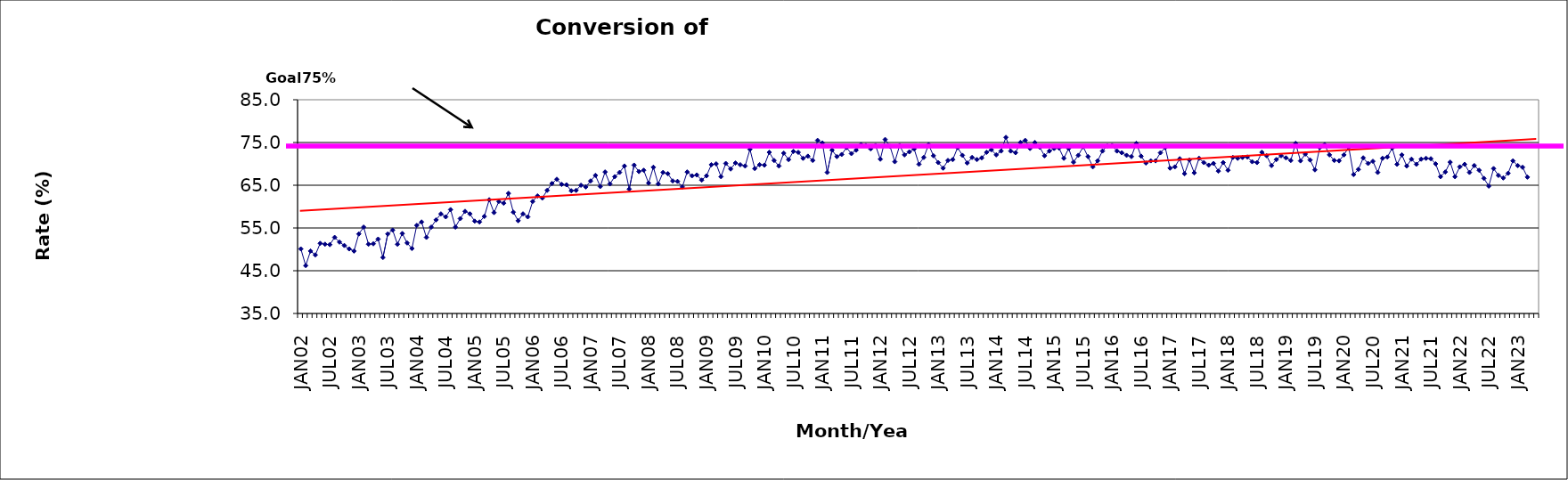
| Category | Series 0 |
|---|---|
| JAN02 | 50.1 |
| FEB02 | 46.2 |
| MAR02 | 49.6 |
| APR02 | 48.7 |
| MAY02 | 51.4 |
| JUN02 | 51.2 |
| JUL02 | 51.1 |
| AUG02 | 52.8 |
| SEP02 | 51.7 |
| OCT02 | 50.9 |
| NOV02 | 50.1 |
| DEC02 | 49.6 |
| JAN03 | 53.6 |
| FEB03 | 55.2 |
| MAR03 | 51.2 |
| APR03 | 51.3 |
| MAY03 | 52.4 |
| JUN03 | 48.1 |
| JUL03 | 53.6 |
| AUG03 | 54.5 |
| SEP03 | 51.2 |
| OCT03 | 53.7 |
| NOV03 | 51.5 |
| DEC03 | 50.2 |
| JAN04 | 55.6 |
| FEB04 | 56.4 |
| MAR04 | 52.8 |
| APR04 | 55.2 |
| MAY04 | 56.9 |
| JUN04 | 58.3 |
| JUL04 | 57.6 |
| AUG04 | 59.3 |
| SEP04 | 55.2 |
| OCT04 | 57.2 |
| NOV04 | 58.9 |
| DEC04 | 58.3 |
| JAN05 | 56.6 |
| FEB05 | 56.4 |
| MAR05 | 57.7 |
| APR05 | 61.6 |
| MAY05 | 58.6 |
| JUN05 | 61.2 |
| JUL05 | 60.8 |
| AUG05 | 63.1 |
| SEP05 | 58.7 |
| OCT05 | 56.7 |
| NOV05 | 58.3 |
| DEC05 | 57.6 |
| JAN06 | 61.2 |
| FEB06 | 62.5 |
| MAR06 | 62 |
| APR06 | 63.8 |
| MAY06 | 65.4 |
| JUN06 | 66.4 |
| JUL06 | 65.2 |
| AUG06 | 65.1 |
| SEP06 | 63.7 |
| OCT06 | 63.8 |
| NOV06 | 65 |
| DEC06 | 64.6 |
| JAN07 | 66 |
| FEB07 | 67.3 |
| MAR07 | 64.7 |
| APR07 | 68.1 |
| MAY07 | 65.3 |
| JUN07 | 67 |
| JUL07 | 68 |
| AUG07 | 69.5 |
| SEP07 | 64.1 |
| OCT07 | 69.7 |
| NOV07 | 68.2 |
| DEC07 | 68.5 |
| JAN08 | 65.5 |
| FEB08 | 69.2 |
| MAR08 | 65.3 |
| APR08 | 68 |
| MAY08 | 67.7 |
| JUN08 | 66 |
| JUL08 | 65.9 |
| AUG08 | 64.6 |
| SEP08 | 68.1 |
| OCT08 | 67.2 |
| NOV08 | 67.4 |
| DEC08 | 66.2 |
| JAN09 | 67.2 |
| FEB09 | 69.8 |
| MAR09 | 70 |
| APR09 | 67 |
| MAY09 | 70.1 |
| JUN09 | 68.8 |
| JUL09 | 70.2 |
| AUG09 | 69.8 |
| SEP09 | 69.5 |
| OCT09 | 73.4 |
| NOV09 | 68.9 |
| DEC09 | 69.8 |
| JAN10 | 69.7 |
| FEB10 | 72.7 |
| MAR10 | 70.8 |
| APR10 | 69.5 |
| MAY10 | 72.5 |
| JUN10 | 71 |
| JUL10 | 72.9 |
| AUG10 | 72.7 |
| SEP10 | 71.3 |
| OCT10 | 71.8 |
| NOV10 | 70.8 |
| DEC10 | 75.5 |
| JAN11 | 74.9 |
| FEB11 | 68 |
| MAR11 | 73.2 |
| APR11 | 71.7 |
| MAY11 | 72.2 |
| JUN11 | 73.8 |
| JUL11 | 72.4 |
| AUG11 | 73.2 |
| SEP11 | 74.5 |
| OCT11 | 74.3 |
| NOV11 | 73.5 |
| DEC11 | 74.3 |
| JAN12 | 71.1 |
| FEB12 | 75.7 |
| MAR12 | 74.1 |
| APR12 | 70.5 |
| MAY12 | 74.3 |
| JUN12 | 72.1 |
| JUL12 | 72.8 |
| AUG12 | 73.5 |
| SEP12 | 69.9 |
| OCT12 | 71.5 |
| NOV12 | 74.5 |
| DEC12 | 71.9 |
| JAN13 | 70.3 |
| FEB13 | 69 |
| MAR13 | 70.8 |
| APR13 | 71 |
| MAY13 | 73.8 |
| JUN13 | 72 |
| JUL13 | 70.2 |
| AUG13 | 71.5 |
| SEP13 | 71 |
| OCT13 | 71.4 |
| NOV13 | 72.7 |
| DEC13 | 73.3 |
| JAN14 | 72.1 |
| FEB14 | 73 |
| MAR14 | 76.2 |
| APR14 | 73 |
| MAY14 | 72.6 |
| JUN14 | 75 |
| JUL14 | 75.5 |
| AUG14 | 73.6 |
| SEP14 | 75 |
| OCT14 | 73.9 |
| NOV14 | 71.9 |
| DEC14 | 73 |
| JAN15 | 73.6 |
| FEB15 | 73.7 |
| MAR15 | 71.3 |
| APR15 | 73.6 |
| MAY15 | 70.4 |
| JUN15 | 72 |
| JUL15 | 74 |
| AUG15 | 71.7 |
| SEP15 | 69.3 |
| OCT15 | 70.7 |
| NOV15 | 73 |
| DEC15 | 74.2 |
| JAN16 | 74.3 |
| FEB16 | 73 |
| MAR16 | 72.6 |
| APR16 | 72 |
| MAY16 | 71.7 |
| JUN16 | 74.8 |
| JUL16 | 71.8 |
| AUG16 | 70.2 |
| SEP16 | 70.7 |
| OCT16 | 70.7 |
| NOV16 | 72.6 |
| DEC16 | 73.8 |
| JAN17 | 69 |
| FEB17 | 69.3 |
| MAR17 | 71.2 |
| APR17 | 67.7 |
| MAY17 | 70.9 |
| JUN17 | 67.9 |
| JUL17 | 71.3 |
| AUG17 | 70.3 |
| SEP17 | 69.7 |
| OCT17 | 70.1 |
| NOV17 | 68.3 |
| DEC17 | 70.3 |
| JAN18 | 68.5 |
| FEB18 | 71.5 |
| MAR18 | 71.3 |
| APR18 | 71.5 |
| MAY18 | 71.6 |
| JUN18 | 70.5 |
| JUL18 | 70.3 |
| AUG18 | 72.7 |
| SEP18 | 71.9 |
| OCT18 | 69.6 |
| NOV18 | 71 |
| DEC18 | 71.9 |
| JAN19 | 71.4 |
| FEB19 | 70.8 |
| MAR19 | 74.8 |
| APR19 | 70.7 |
| MAY19 | 72.3 |
| JUN19 | 70.9 |
| JUL19 | 68.6 |
| AUG19 | 73.8 |
| SEP19 | 74.5 |
| OCT19 | 72.1 |
| NOV19 | 70.8 |
| DEC19 | 70.7 |
| JAN20 | 72.1 |
| FEB20 | 73.9 |
| MAR20 | 67.5 |
| APR20 | 68.7 |
| MAY20 | 71.4 |
| JUN20 | 70.1 |
| JUL20 | 70.6 |
| AUG20 | 68 |
| SEP20 | 71.3 |
| OCT20 | 71.6 |
| NOV20 | 73.7 |
| DEC20 | 69.9 |
| JAN21 | 72.1 |
| FEB21 | 69.5 |
| MAR21 | 71.1 |
| APR21 | 69.9 |
| MAY21 | 71.1 |
| JUN21 | 71.3 |
| JUL21 | 71.2 |
| AUG21 | 70 |
| SEP21 | 67 |
| OCT21 | 68.1 |
| NOV21 | 70.4 |
| DEC21 | 67 |
| JAN22 | 69.3 |
| FEB22 | 69.9 |
| MAR22 | 68 |
| APR22 | 69.6 |
| MAY22 | 68.5 |
| JUN22 | 66.6 |
| JUL22 | 64.8 |
| AUG22 | 68.9 |
| SEP22 | 67.3 |
| OCT22 | 66.7 |
| NOV22 | 67.8 |
| DEC22 | 70.7 |
| JAN23 | 69.6 |
| FEB23 | 69.2 |
| MAR23 | 66.9 |